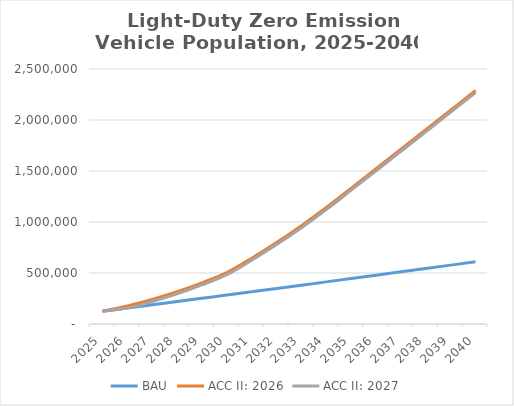
| Category | BAU | ACC II: 2026 | ACC II: 2027 |
|---|---|---|---|
| 2025.0 | 124778.736 | 124778.736 | 124778.736 |
| 2026.0 | 156614.904 | 176605.056 | 156614.904 |
| 2027.0 | 188447.298 | 240269.844 | 220279.692 |
| 2028.0 | 220274.963 | 315768.027 | 295777.874 |
| 2029.0 | 252096.946 | 403093.467 | 383103.315 |
| 2030.0 | 283912.292 | 503718.748 | 483728.596 |
| 2031.0 | 315907.328 | 645092.162 | 625102.01 |
| 2032.0 | 348081.991 | 798483.001 | 778492.849 |
| 2033.0 | 380436.221 | 964016.271 | 944026.119 |
| 2034.0 | 412969.955 | 1141816.91 | 1121826.758 |
| 2035.0 | 445683.132 | 1332009.795 | 1312019.643 |
| 2036.0 | 478466.912 | 1522613.169 | 1502623.016 |
| 2037.0 | 511321.296 | 1713627.03 | 1693636.878 |
| 2038.0 | 544246.284 | 1905051.38 | 1885061.228 |
| 2039.0 | 577241.876 | 2096886.218 | 2076896.066 |
| 2040.0 | 610308.073 | 2289131.545 | 2269141.393 |